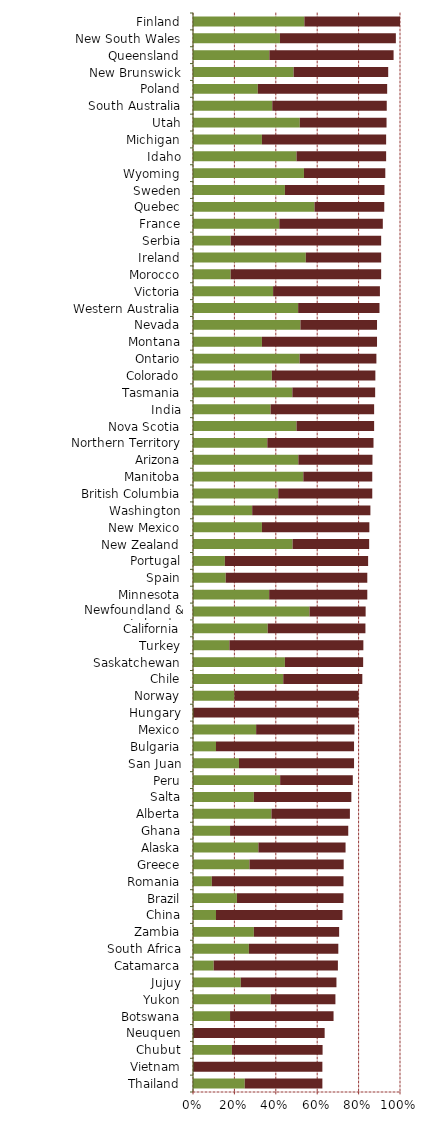
| Category |   Encourages Investment |   Not a Deterrent to Investment |
|---|---|---|
| Thailand | 0.25 | 0.375 |
| Vietnam | 0 | 0.625 |
| Chubut | 0.188 | 0.438 |
| Neuquen | 0 | 0.636 |
| Botswana | 0.179 | 0.5 |
| Yukon | 0.375 | 0.313 |
| Jujuy | 0.231 | 0.462 |
| Catamarca | 0.1 | 0.6 |
| South Africa | 0.27 | 0.432 |
| Zambia | 0.294 | 0.412 |
| China | 0.111 | 0.611 |
| Brazil | 0.212 | 0.515 |
| Romania | 0.091 | 0.636 |
| Greece | 0.273 | 0.455 |
| Alaska | 0.316 | 0.421 |
| Ghana | 0.179 | 0.571 |
| Alberta | 0.379 | 0.379 |
| Salta | 0.294 | 0.471 |
| Peru | 0.421 | 0.351 |
| San Juan | 0.222 | 0.556 |
| Bulgaria | 0.111 | 0.667 |
| Mexico | 0.305 | 0.475 |
| Hungary | 0 | 0.8 |
| Norway | 0.2 | 0.6 |
| Chile | 0.436 | 0.382 |
| Saskatchewan | 0.444 | 0.378 |
| Turkey | 0.176 | 0.647 |
| California | 0.361 | 0.472 |
| Newfoundland & Labrador | 0.563 | 0.271 |
| Minnesota | 0.368 | 0.474 |
| Spain | 0.158 | 0.684 |
| Portugal | 0.154 | 0.692 |
| New Zealand | 0.481 | 0.37 |
| New Mexico | 0.333 | 0.519 |
| Washington | 0.286 | 0.571 |
| British Columbia | 0.412 | 0.454 |
| Manitoba | 0.533 | 0.333 |
| Arizona | 0.509 | 0.358 |
| Northern Territory | 0.359 | 0.513 |
| Nova Scotia | 0.5 | 0.375 |
| India | 0.375 | 0.5 |
| Tasmania | 0.48 | 0.4 |
| Colorado | 0.381 | 0.5 |
| Ontario | 0.515 | 0.371 |
| Montana | 0.333 | 0.556 |
| Nevada | 0.519 | 0.37 |
| Western Australia | 0.508 | 0.393 |
| Victoria | 0.387 | 0.516 |
| Morocco | 0.182 | 0.727 |
| Ireland | 0.545 | 0.364 |
| Serbia | 0.182 | 0.727 |
| France | 0.417 | 0.5 |
| Quebec | 0.587 | 0.337 |
| Sweden | 0.444 | 0.481 |
| Wyoming | 0.536 | 0.393 |
| Idaho | 0.5 | 0.433 |
| Michigan | 0.333 | 0.6 |
| Utah | 0.516 | 0.419 |
| South Australia | 0.383 | 0.553 |
| Poland | 0.313 | 0.625 |
| New Brunswick | 0.486 | 0.457 |
| Queensland | 0.369 | 0.6 |
| New South Wales | 0.42 | 0.56 |
| Finland | 0.538 | 0.462 |